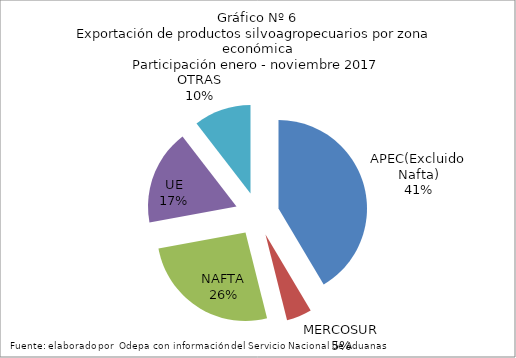
| Category | Series 0 |
|---|---|
| APEC(Excluido Nafta) | 5989608.821 |
| MERCOSUR | 665971.232 |
| NAFTA | 3759219.36 |
| UE | 2520451.193 |
| OTRAS | 1508247.394 |